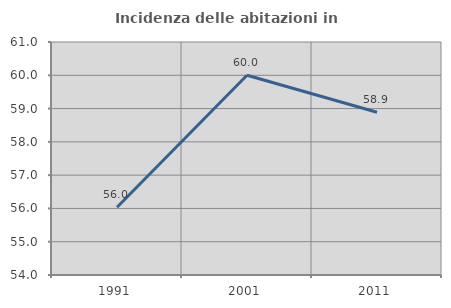
| Category | Incidenza delle abitazioni in proprietà  |
|---|---|
| 1991.0 | 56.037 |
| 2001.0 | 60 |
| 2011.0 | 58.891 |